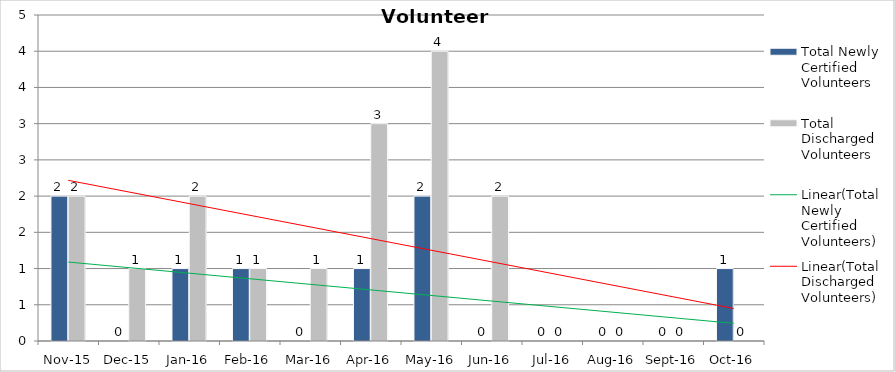
| Category | Total Newly Certified Volunteers | Total Discharged Volunteers |
|---|---|---|
| Nov-15 | 2 | 2 |
| Dec-15 | 0 | 1 |
| Jan-16 | 1 | 2 |
| Feb-16 | 1 | 1 |
| Mar-16 | 0 | 1 |
| Apr-16 | 1 | 3 |
| May-16 | 2 | 4 |
| Jun-16 | 0 | 2 |
| Jul-16 | 0 | 0 |
| Aug-16 | 0 | 0 |
| Sep-16 | 0 | 0 |
| Oct-16 | 1 | 0 |